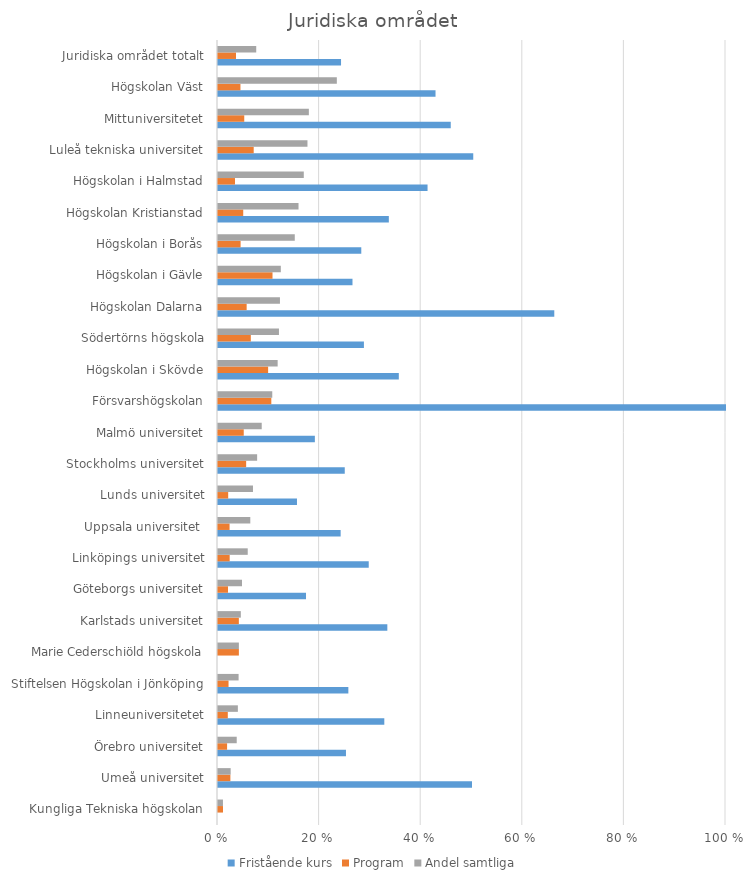
| Category | Fristående kurs | Program | Andel samtliga |
|---|---|---|---|
| Kungliga Tekniska högskolan | 0 | 0.01 | 0.01 |
| Umeå universitet | 0.5 | 0.024 | 0.025 |
| Örebro universitet | 0.252 | 0.018 | 0.037 |
| Linneuniversitetet | 0.327 | 0.019 | 0.039 |
| Stiftelsen Högskolan i Jönköping | 0.257 | 0.021 | 0.041 |
| Marie Cederschiöld högskola | 0 | 0.041 | 0.041 |
| Karlstads universitet | 0.333 | 0.041 | 0.045 |
| Göteborgs universitet | 0.173 | 0.02 | 0.047 |
| Linköpings universitet | 0.297 | 0.023 | 0.059 |
| Uppsala universitet  | 0.241 | 0.023 | 0.064 |
| Lunds universitet | 0.155 | 0.02 | 0.069 |
| Stockholms universitet | 0.25 | 0.055 | 0.077 |
| Malmö universitet | 0.191 | 0.051 | 0.086 |
| Försvarshögskolan | 1 | 0.105 | 0.107 |
| Högskolan i Skövde | 0.356 | 0.099 | 0.117 |
| Södertörns högskola | 0.287 | 0.065 | 0.12 |
| Högskolan Dalarna | 0.662 | 0.056 | 0.122 |
| Högskolan i Gävle | 0.265 | 0.107 | 0.124 |
| Högskolan i Borås | 0.282 | 0.045 | 0.151 |
| Högskolan Kristianstad | 0.336 | 0.05 | 0.159 |
| Högskolan i Halmstad | 0.412 | 0.033 | 0.169 |
| Luleå tekniska universitet | 0.502 | 0.07 | 0.176 |
| Mittuniversitetet | 0.458 | 0.052 | 0.179 |
| Högskolan Väst | 0.428 | 0.044 | 0.234 |
| Juridiska området totalt | 0.242 | 0.035 | 0.075 |